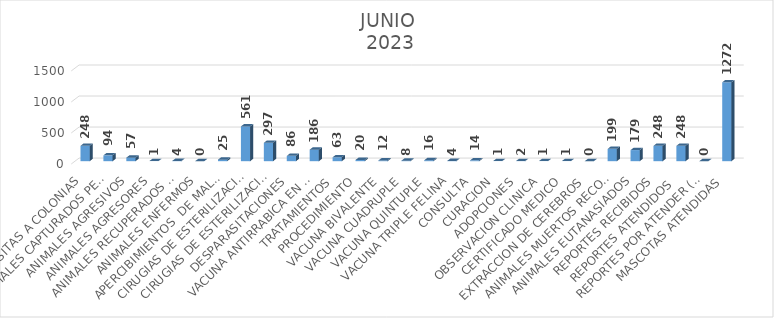
| Category | Series 0 |
|---|---|
| VISITAS A COLONIAS | 248 |
| ANIMALES CAPTURADOS PERROS Y GATOS  | 94 |
| ANIMALES AGRESIVOS | 57 |
| ANIMALES AGRESORES | 1 |
| ANIMALES RECUPERADOS POR SUS DUEÑOS | 4 |
| ANIMALES ENFERMOS | 0 |
| APERCIBIMIENTOS  DE MALTRATO ANIMAL | 25 |
| CIRUGIAS DE ESTERILIZACION (OVH) hembra | 561 |
| CIRUGIAS DE ESTERILIZACION (ORQ) macho | 297 |
| DESPARASITACIONES | 86 |
| VACUNA ANTIRRABICA EN OFICINA Y CAMPAÑAS  | 186 |
| TRATAMIENTOS | 63 |
| PROCEDIMIENTO | 20 |
| VACUNA BIVALENTE | 12 |
| VACUNA CUADRUPLE | 8 |
| VACUNA QUINTUPLE | 16 |
| VACUNA TRIPLE FELINA | 4 |
| CONSULTA | 14 |
| CURACION | 1 |
| ADOPCIONES | 2 |
| OBSERVACION CLINICA | 1 |
| CERTIFICADO MEDICO | 1 |
| EXTRACCION DE CEREBROS | 0 |
| ANIMALES MUERTOS RECOLECTADOS | 199 |
| ANIMALES EUTANASIADOS | 179 |
| REPORTES RECIBIDOS | 248 |
| REPORTES ATENDIDOS  | 248 |
| REPORTES POR ATENDER (PENDIENTES) | 0 |
| MASCOTAS ATENDIDAS | 1272 |